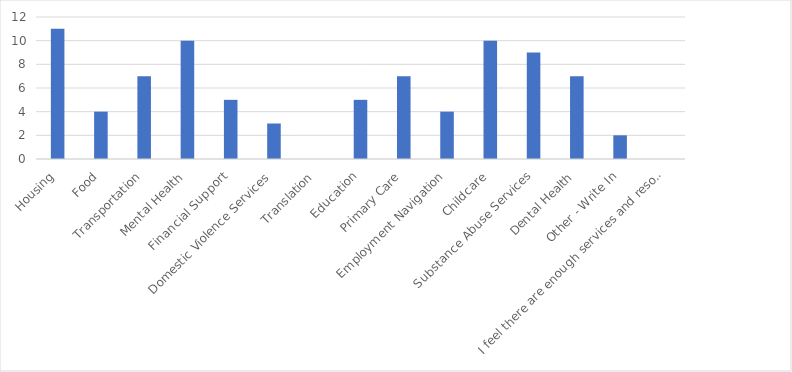
| Category | Number of Responses |
|---|---|
| Housing | 11 |
| Food | 4 |
| Transportation | 7 |
| Mental Health | 10 |
| Financial Support | 5 |
| Domestic Violence Services | 3 |
| Translation | 0 |
| Education | 5 |
| Primary Care | 7 |
| Employment Navigation | 4 |
| Childcare | 10 |
| Substance Abuse Services | 9 |
| Dental Health | 7 |
| Other - Write In | 2 |
| I feel there are enough services and resources to refer my patients/clients to. | 0 |